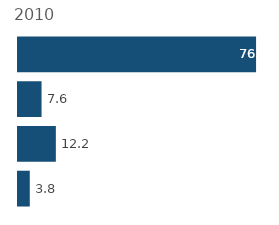
| Category | Series 0 |
|---|---|
| 0 | 3.784 |
| 1 | 12.162 |
| 2 | 7.568 |
| 3 | 76.486 |